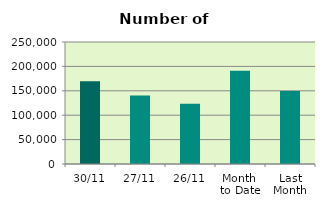
| Category | Series 0 |
|---|---|
| 30/11 | 169392 |
| 27/11 | 140186 |
| 26/11 | 123432 |
| Month 
to Date | 191084.095 |
| Last
Month | 149554.818 |